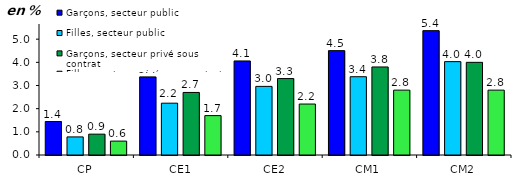
| Category | Garçons, secteur public | Filles, secteur public | Garçons, secteur privé sous contrat | Filles, secteur privé sous contrat |
|---|---|---|---|---|
| CP | 1.445 | 0.78 | 0.9 | 0.6 |
| CE1 | 3.372 | 2.237 | 2.7 | 1.7 |
| CE2 | 4.06 | 2.962 | 3.3 | 2.2 |
| CM1 | 4.505 | 3.379 | 3.8 | 2.8 |
| CM2 | 5.367 | 4.03 | 4 | 2.8 |